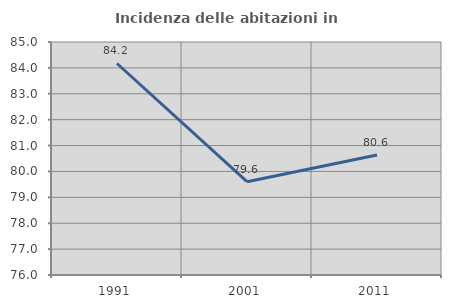
| Category | Incidenza delle abitazioni in proprietà  |
|---|---|
| 1991.0 | 84.17 |
| 2001.0 | 79.605 |
| 2011.0 | 80.635 |